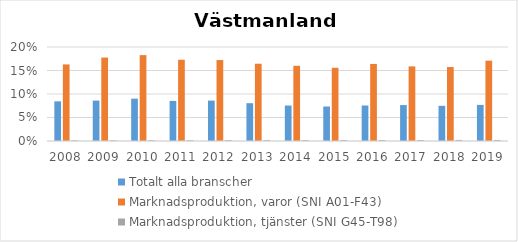
| Category | Totalt alla branscher | Marknadsproduktion, varor (SNI A01-F43) | Marknadsproduktion, tjänster (SNI G45-T98) |
|---|---|---|---|
| 2008 | 0.084 | 0.163 | 0.002 |
| 2009 | 0.086 | 0.178 | 0.002 |
| 2010 | 0.09 | 0.183 | 0.002 |
| 2011 | 0.085 | 0.173 | 0.002 |
| 2012 | 0.086 | 0.172 | 0.002 |
| 2013 | 0.08 | 0.164 | 0.002 |
| 2014 | 0.075 | 0.16 | 0.002 |
| 2015 | 0.073 | 0.156 | 0.002 |
| 2016 | 0.076 | 0.164 | 0.002 |
| 2017 | 0.076 | 0.159 | 0.002 |
| 2018 | 0.075 | 0.157 | 0.002 |
| 2019 | 0.077 | 0.171 | 0.002 |